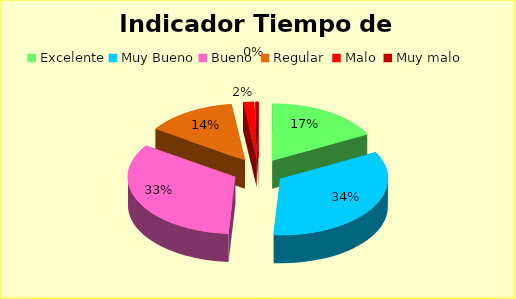
| Category | Series 0 |
|---|---|
| Excelente | 0.173 |
| Muy Bueno | 0.337 |
| Bueno  | 0.333 |
| Regular  | 0.136 |
| Malo  | 0.016 |
| Muy malo  | 0.004 |